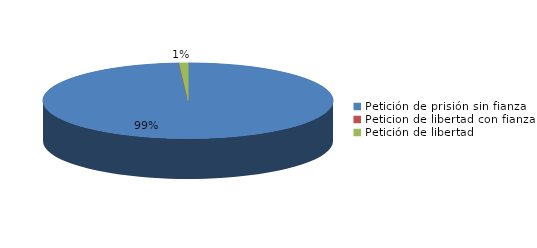
| Category | Series 0 |
|---|---|
| Petición de prisión sin fianza | 100 |
| Peticion de libertad con fianza | 0 |
| Petición de libertad | 1 |